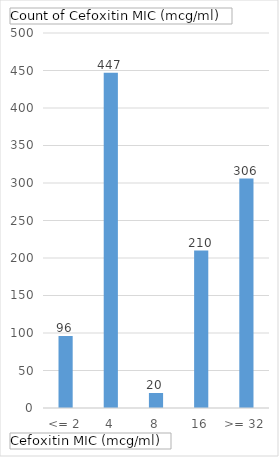
| Category | Total |
|---|---|
| <= 2 | 96 |
| 4 | 447 |
| 8 | 20 |
| 16 | 210 |
| >= 32 | 306 |